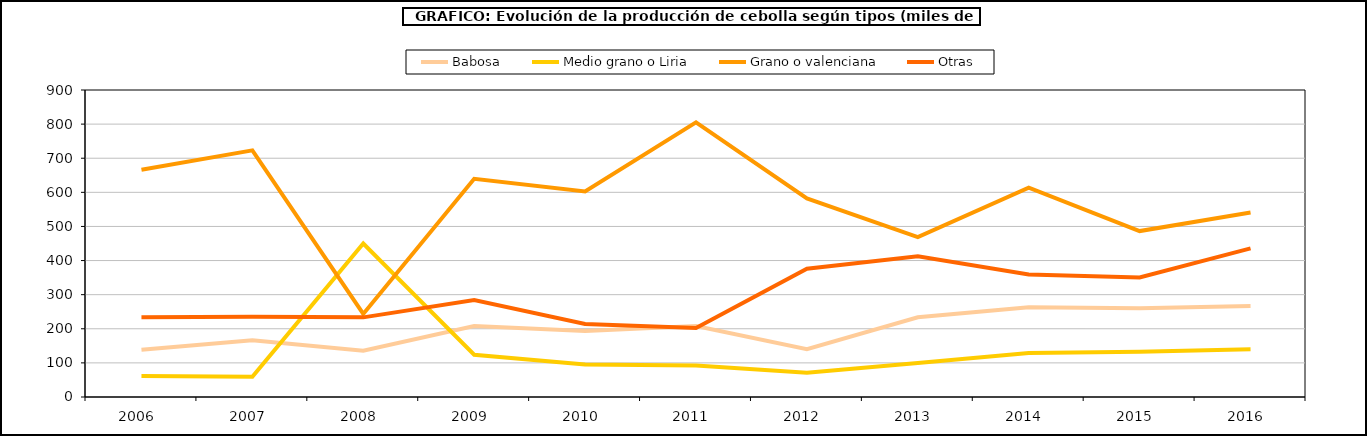
| Category | Babosa | Medio grano o Liria | Grano o valenciana | Otras |
|---|---|---|---|---|
| 2006.0 | 138.241 | 61.281 | 666.346 | 233.683 |
| 2007.0 | 166.457 | 59.422 | 722.921 | 235.45 |
| 2008.0 | 135.75 | 449.968 | 243.373 | 233.447 |
| 2009.0 | 208.229 | 123.904 | 639.656 | 284.499 |
| 2010.0 | 193.415 | 95.014 | 602.708 | 213.99 |
| 2011.0 | 207.933 | 92.32 | 804.939 | 202.339 |
| 2012.0 | 140.272 | 70.819 | 582.337 | 376.293 |
| 2013.0 | 233.875 | 99.562 | 468.759 | 412.305 |
| 2014.0 | 263.155 | 128.911 | 613.774 | 358.887 |
| 2015.0 | 260.238 | 132.601 | 486.456 | 350.547 |
| 2016.0 | 267.04 | 140.214 | 541.052 | 435.792 |